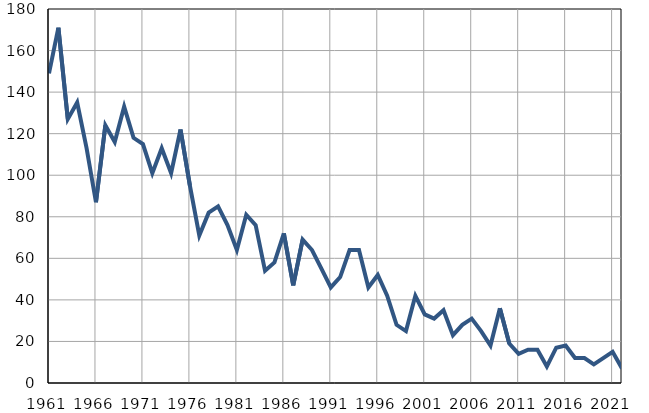
| Category | Умрла 
одојчад |
|---|---|
| 1961.0 | 149 |
| 1962.0 | 171 |
| 1963.0 | 127 |
| 1964.0 | 135 |
| 1965.0 | 113 |
| 1966.0 | 87 |
| 1967.0 | 124 |
| 1968.0 | 116 |
| 1969.0 | 133 |
| 1970.0 | 118 |
| 1971.0 | 115 |
| 1972.0 | 101 |
| 1973.0 | 113 |
| 1974.0 | 101 |
| 1975.0 | 122 |
| 1976.0 | 95 |
| 1977.0 | 71 |
| 1978.0 | 82 |
| 1979.0 | 85 |
| 1980.0 | 76 |
| 1981.0 | 64 |
| 1982.0 | 81 |
| 1983.0 | 76 |
| 1984.0 | 54 |
| 1985.0 | 58 |
| 1986.0 | 72 |
| 1987.0 | 47 |
| 1988.0 | 69 |
| 1989.0 | 64 |
| 1990.0 | 55 |
| 1991.0 | 46 |
| 1992.0 | 51 |
| 1993.0 | 64 |
| 1994.0 | 64 |
| 1995.0 | 46 |
| 1996.0 | 52 |
| 1997.0 | 42 |
| 1998.0 | 28 |
| 1999.0 | 25 |
| 2000.0 | 42 |
| 2001.0 | 33 |
| 2002.0 | 31 |
| 2003.0 | 35 |
| 2004.0 | 23 |
| 2005.0 | 28 |
| 2006.0 | 31 |
| 2007.0 | 25 |
| 2008.0 | 18 |
| 2009.0 | 36 |
| 2010.0 | 19 |
| 2011.0 | 14 |
| 2012.0 | 16 |
| 2013.0 | 16 |
| 2014.0 | 8 |
| 2015.0 | 17 |
| 2016.0 | 18 |
| 2017.0 | 12 |
| 2018.0 | 12 |
| 2019.0 | 9 |
| 2020.0 | 12 |
| 2021.0 | 15 |
| 2022.0 | 7 |